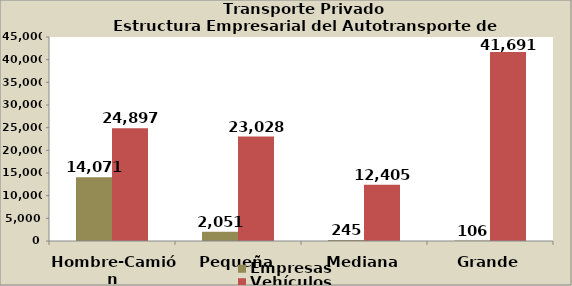
| Category | Empresas | Vehículos |
|---|---|---|
| Hombre-Camión | 14071 | 24897 |
| Pequeña | 2051 | 23028 |
| Mediana | 245 | 12405 |
| Grande | 106 | 41691 |